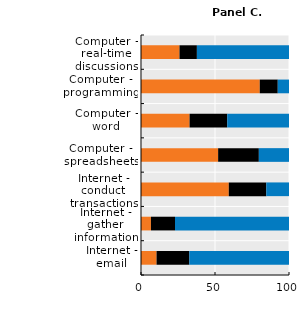
| Category | Never | Less than once a week | At least once a week |
|---|---|---|---|
| Internet - email | 10.515 | 22.145 | 67.34 |
| Internet - gather information | 6.722 | 16.251 | 77.027 |
| Internet - conduct transactions | 59.315 | 25.338 | 15.347 |
| Computer - spreadsheets | 52.116 | 27.513 | 20.371 |
| Computer - word | 32.832 | 25.449 | 41.719 |
| Computer - programming | 80.248 | 12.16 | 7.592 |
| Computer - real-time discussions | 26.021 | 11.747 | 62.232 |